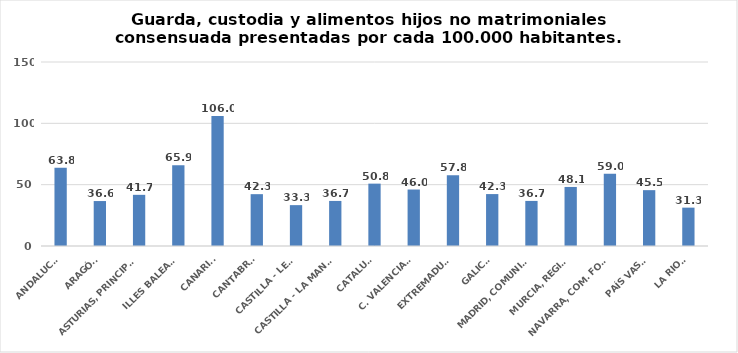
| Category | Series 0 |
|---|---|
| ANDALUCÍA | 63.803 |
| ARAGÓN | 36.644 |
| ASTURIAS, PRINCIPADO | 41.708 |
| ILLES BALEARS | 65.899 |
| CANARIAS | 106.031 |
| CANTABRIA | 42.258 |
| CASTILLA - LEÓN | 33.317 |
| CASTILLA - LA MANCHA | 36.74 |
| CATALUÑA | 50.841 |
| C. VALENCIANA | 46.045 |
| EXTREMADURA | 57.763 |
| GALICIA | 42.328 |
| MADRID, COMUNIDAD | 36.749 |
| MURCIA, REGIÓN | 48.14 |
| NAVARRA, COM. FORAL | 58.954 |
| PAÍS VASCO | 45.529 |
| LA RIOJA | 31.27 |